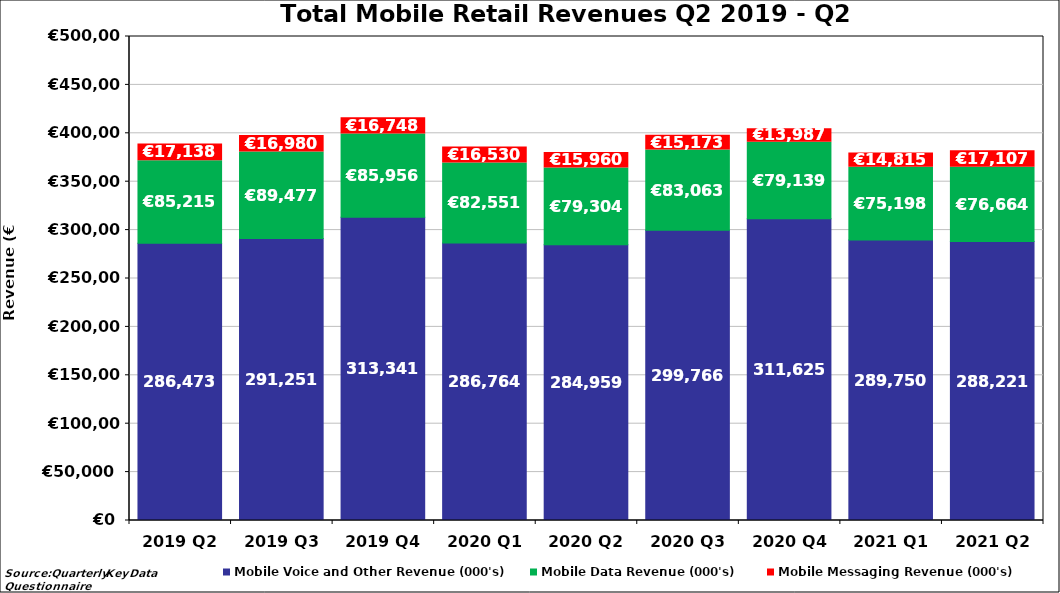
| Category | Mobile Voice and Other Revenue (000's) | Mobile Data Revenue (000's) | Mobile Messaging Revenue (000's) |
|---|---|---|---|
| 2019 Q2 | 286472.553 | 85214.89 | 17138.438 |
| 2019 Q3 | 291250.878 | 89477.355 | 16980.077 |
| 2019 Q4 | 313340.616 | 85955.659 | 16747.708 |
| 2020 Q1 | 286764 | 82551 | 16530.453 |
| 2020 Q2 | 284959 | 79304 | 15960 |
| 2020 Q3 | 299766 | 83063 | 15173 |
| 2020 Q4 | 311625.153 | 79139.116 | 13986.661 |
| 2021 Q1 | 289750.194 | 75197.694 | 14815.333 |
| 2021 Q2 | 288220.9 | 76664.088 | 17106.539 |